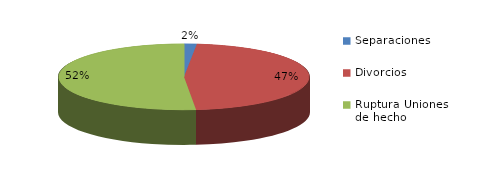
| Category | Series 0 |
|---|---|
| Separaciones | 23 |
| Divorcios | 667 |
| Ruptura Uniones de hecho | 733 |